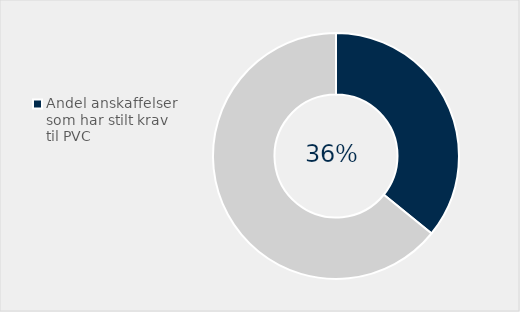
| Category | Series 0 |
|---|---|
| Andel anskaffelser som har stilt krav til PVC | 0.358 |
| Ikke stilt krav | 0.642 |